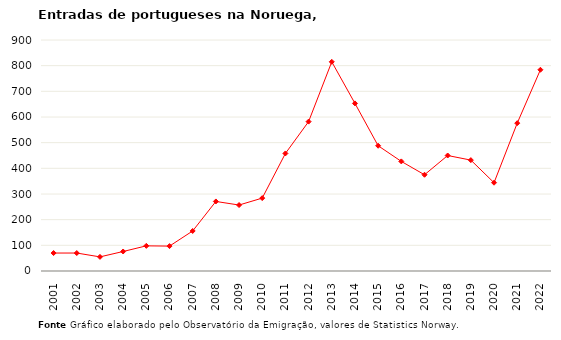
| Category | Entradas |
|---|---|
| 2001.0 | 70 |
| 2002.0 | 70 |
| 2003.0 | 55 |
| 2004.0 | 76 |
| 2005.0 | 98 |
| 2006.0 | 97 |
| 2007.0 | 156 |
| 2008.0 | 271 |
| 2009.0 | 257 |
| 2010.0 | 284 |
| 2011.0 | 458 |
| 2012.0 | 582 |
| 2013.0 | 815 |
| 2014.0 | 653 |
| 2015.0 | 488 |
| 2016.0 | 427 |
| 2017.0 | 375 |
| 2018.0 | 450 |
| 2019.0 | 432 |
| 2020.0 | 344 |
| 2021.0 | 576 |
| 2022.0 | 784 |